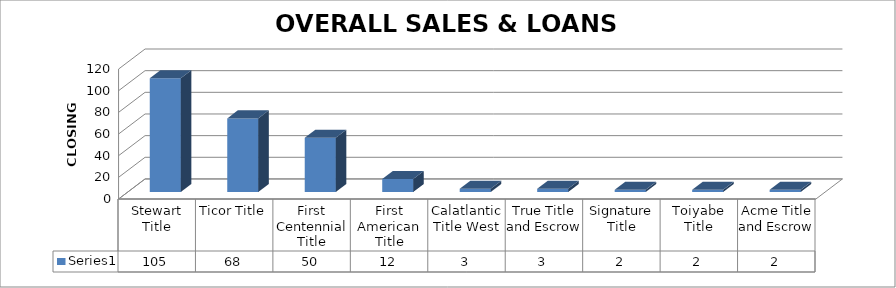
| Category | Series 0 |
|---|---|
| Stewart Title | 105 |
| Ticor Title | 68 |
| First Centennial Title | 50 |
| First American Title | 12 |
| Calatlantic Title West | 3 |
| True Title and Escrow | 3 |
| Signature Title | 2 |
| Toiyabe Title | 2 |
| Acme Title and Escrow | 2 |